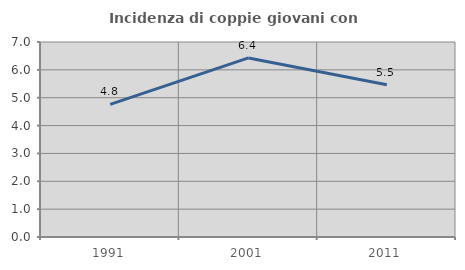
| Category | Incidenza di coppie giovani con figli |
|---|---|
| 1991.0 | 4.762 |
| 2001.0 | 6.429 |
| 2011.0 | 5.469 |